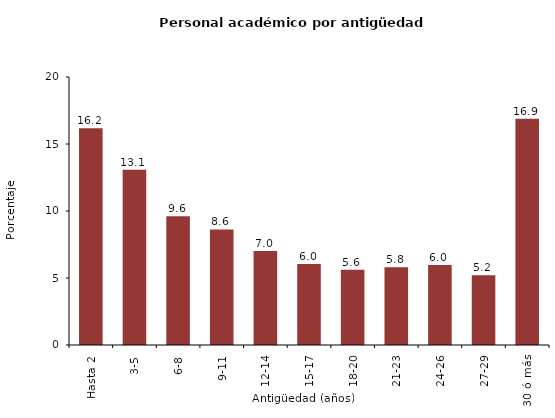
| Category | Series 0 |
|---|---|
| Hasta 2 | 16.174 |
| 3-5 | 13.079 |
| 6-8 | 9.615 |
| 9-11 | 8.62 |
| 12-14 | 7.016 |
| 15-17 | 6.041 |
| 18-20 | 5.62 |
| 21-23 | 5.797 |
| 24-26 | 5.961 |
| 27-29 | 5.197 |
| 30 ó más | 16.878 |